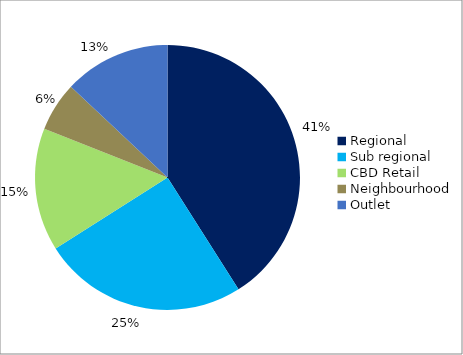
| Category | Series 0 |
|---|---|
| Regional | 0.41 |
| Sub regional | 0.25 |
| CBD Retail | 0.15 |
| Neighbourhood | 0.06 |
| Outlet | 0.13 |